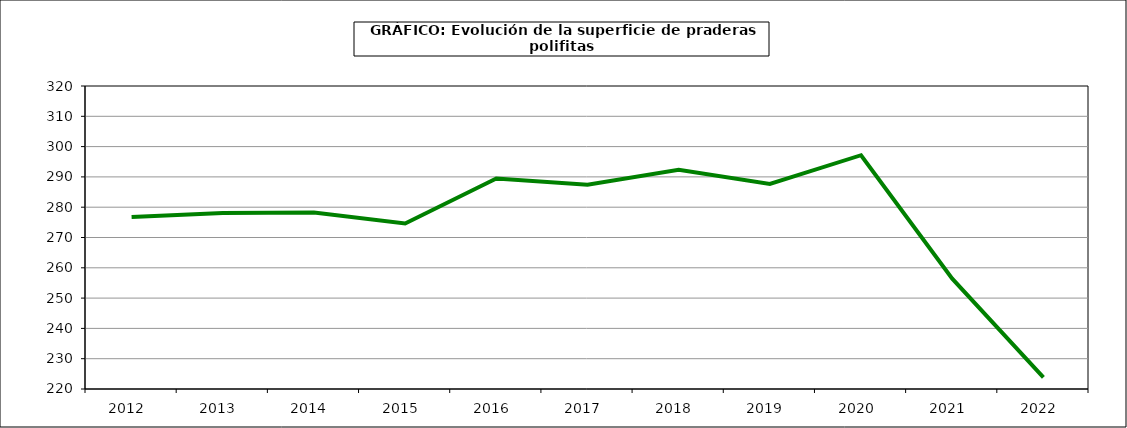
| Category | Superficie |
|---|---|
| 2012.0 | 276.784 |
| 2013.0 | 278.082 |
| 2014.0 | 278.257 |
| 2015.0 | 274.641 |
| 2016.0 | 289.468 |
| 2017.0 | 287.402 |
| 2018.0 | 292.359 |
| 2019.0 | 287.689 |
| 2020.0 | 297.158 |
| 2021.0 | 256.429 |
| 2022.0 | 223.863 |